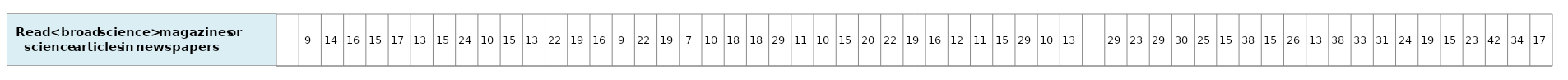
| Category | Read <broad science> magazines or science articles in newspapers |
|---|---|
| nan | 1 |
| 9.329783059949106 | 1 |
| 14.35232256424979 | 1 |
| 16.27057207555161 | 1 |
| 15.20851037373422 | 1 |
| 17.11960427431069 | 1 |
| 13.12751916852338 | 1 |
| 14.5888804932555 | 1 |
| 24.401124907196 | 1 |
| 9.850010940811744 | 1 |
| 14.53124207955506 | 1 |
| 12.89443986229635 | 1 |
| 21.84776956793376 | 1 |
| 18.60929708899439 | 1 |
| 15.88042812637679 | 1 |
| 8.51360779203713 | 1 |
| 22.04232708202626 | 1 |
| 18.82878770811346 | 1 |
| 7.107344121429077 | 1 |
| 10.34827320315806 | 1 |
| 18.38200236167223 | 1 |
| 17.63076901176885 | 1 |
| 29.2182410681524 | 1 |
| 11.07820239609904 | 1 |
| 9.694258245450877 | 1 |
| 14.66615962153467 | 1 |
| 19.97676101226598 | 1 |
| 21.91702939042188 | 1 |
| 18.56706470042939 | 1 |
| 15.72056414939646 | 1 |
| 11.55446241774435 | 1 |
| 11.45958511007485 | 1 |
| 15.37158603816827 | 1 |
| 28.61206476837335 | 1 |
| 10.03627023722082 | 1 |
| 13.4525961610887 | 1 |
| nan | 1 |
| 29.26465230444883 | 1 |
| 22.74214662795527 | 1 |
| 29.21192222643841 | 1 |
| 30.33687050611562 | 1 |
| 25.23525630063945 | 1 |
| 15.34022952246999 | 1 |
| 37.8290912460539 | 1 |
| 14.74824242844549 | 1 |
| 25.92187538334899 | 1 |
| 12.70653713872648 | 1 |
| 37.84758396215221 | 1 |
| 32.80053769706724 | 1 |
| 31.0220869916512 | 1 |
| 24.23074182663895 | 1 |
| 18.73657106652423 | 1 |
| 14.70773136608697 | 1 |
| 22.57303895852493 | 1 |
| 42.33504627019757 | 1 |
| 34.25251213391191 | 1 |
| 17.3013696939286 | 1 |